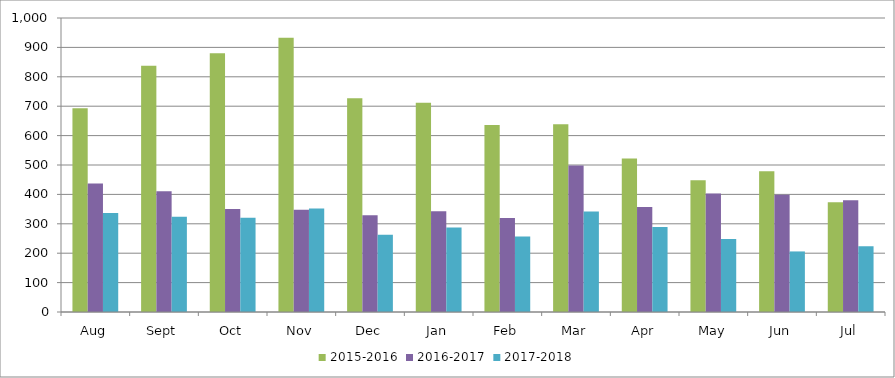
| Category | 2015-2016 | 2016-2017 | 2017-2018 |
|---|---|---|---|
| Aug | 693 | 437 | 337 |
| Sept | 838 | 411 | 324 |
| Oct | 880 | 350 | 321 |
| Nov | 933 | 348 | 352 |
| Dec | 727 | 329 | 263 |
| Jan | 712 | 343 | 287 |
| Feb | 636 | 320 | 257 |
| Mar | 639 | 498 | 342 |
| Apr | 522 | 357 | 289 |
| May | 448 | 403 | 248 |
| Jun | 479 | 399 | 206 |
| Jul | 373 | 380 | 224 |